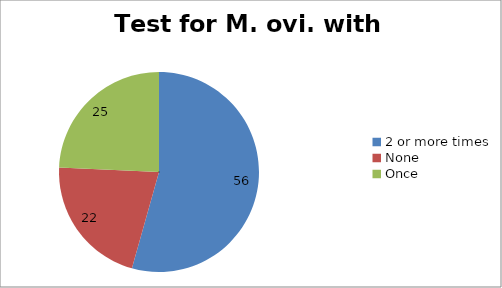
| Category | Series 1 | Series 0 |
|---|---|---|
| 2 or more times | 56 | 48 |
| None | 22 | 32 |
| Once | 25 | 23 |